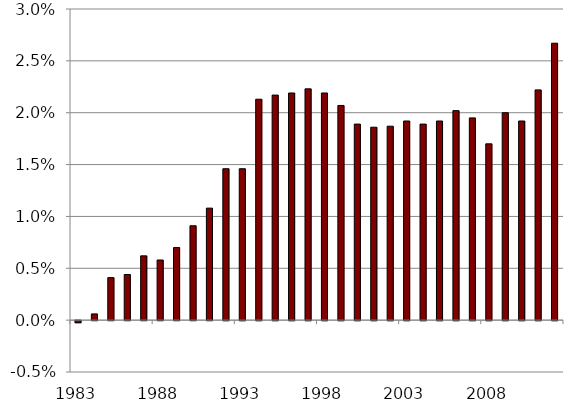
| Category | Deficit |
|---|---|
| 1983.0 | 0 |
| 1984.0 | 0.001 |
| 1985.0 | 0.004 |
| 1986.0 | 0.004 |
| 1987.0 | 0.006 |
| 1988.0 | 0.006 |
| 1989.0 | 0.007 |
| 1990.0 | 0.009 |
| 1991.0 | 0.011 |
| 1992.0 | 0.015 |
| 1993.0 | 0.015 |
| 1994.0 | 0.021 |
| 1995.0 | 0.022 |
| 1996.0 | 0.022 |
| 1997.0 | 0.022 |
| 1998.0 | 0.022 |
| 1999.0 | 0.021 |
| 2000.0 | 0.019 |
| 2001.0 | 0.019 |
| 2002.0 | 0.019 |
| 2003.0 | 0.019 |
| 2004.0 | 0.019 |
| 2005.0 | 0.019 |
| 2006.0 | 0.02 |
| 2007.0 | 0.02 |
| 2008.0 | 0.017 |
| 2009.0 | 0.02 |
| 2010.0 | 0.019 |
| 2011.0 | 0.022 |
| 2012.0 | 0.027 |